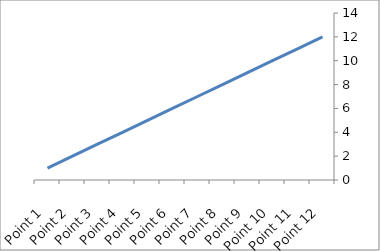
| Category | Series 1 |
|---|---|
| Point 1 | 1 |
| Point 2 | 2 |
| Point 3 | 3 |
| Point 4 | 4 |
| Point 5 | 5 |
| Point 6 | 6 |
| Point 7 | 7 |
| Point 8 | 8 |
| Point 9 | 9 |
| Point 10 | 10 |
| Point 11 | 11 |
| Point 12 | 12 |